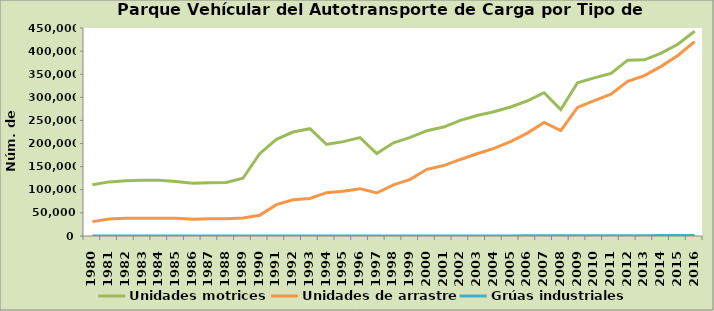
| Category | Unidades motrices | Unidades de arrastre | Grúas industriales |
|---|---|---|---|
| 1980.0 | 110810 | 31120 | 0 |
| 1981.0 | 117090 | 36760 | 0 |
| 1982.0 | 119309 | 38216 | 0 |
| 1983.0 | 120702 | 38639 | 0 |
| 1984.0 | 120702 | 38639 | 0 |
| 1985.0 | 117956 | 38317 | 0 |
| 1986.0 | 114000 | 36500 | 0 |
| 1987.0 | 115092 | 37245 | 0 |
| 1988.0 | 115897 | 37506 | 0 |
| 1989.0 | 124897 | 39113 | 0 |
| 1990.0 | 178130 | 44853 | 0 |
| 1991.0 | 209060 | 67865 | 0 |
| 1992.0 | 224913 | 78233 | 0 |
| 1993.0 | 232203 | 81307 | 0 |
| 1994.0 | 198273 | 93827 | 0 |
| 1995.0 | 204117 | 96638 | 0 |
| 1996.0 | 212909 | 102409 | 0 |
| 1997.0 | 178332 | 92999 | 0 |
| 1998.0 | 201587 | 110530 | 0 |
| 1999.0 | 213292 | 122619 | 126 |
| 2000.0 | 227847 | 144225 | 191 |
| 2001.0 | 235767 | 152341 | 212 |
| 2002.0 | 250025 | 165601 | 221 |
| 2003.0 | 260645 | 177864 | 251 |
| 2004.0 | 268725 | 189568 | 256 |
| 2005.0 | 279112 | 204186 | 266 |
| 2006.0 | 292418 | 222580 | 281 |
| 2007.0 | 310013 | 245843 | 294 |
| 2008.0 | 273455 | 227806 | 277 |
| 2009.0 | 331686 | 278133 | 329 |
| 2010.0 | 342064 | 293053 | 351 |
| 2011.0 | 351705 | 306700 | 355 |
| 2012.0 | 380342 | 334858 | 483 |
| 2013.0 | 381250 | 347112 | 684 |
| 2014.0 | 395552 | 367051 | 877 |
| 2015.0 | 414790 | 390563 | 1052 |
| 2016.0 | 443058 | 420553 | 1224 |